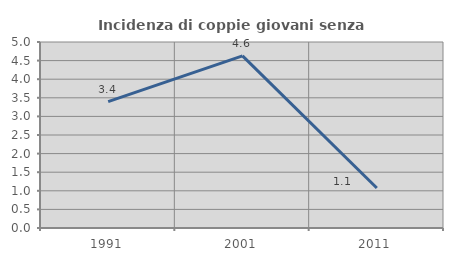
| Category | Incidenza di coppie giovani senza figli |
|---|---|
| 1991.0 | 3.396 |
| 2001.0 | 4.626 |
| 2011.0 | 1.075 |